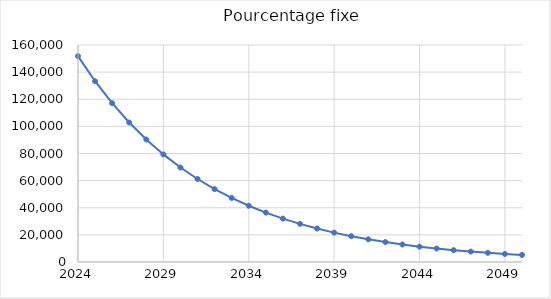
| Category | Pourcentage fixe |
|---|---|
| 2024.0 | 151788 |
| 2025.0 | 133316.002 |
| 2026.0 | 117091.973 |
| 2027.0 | 102842.344 |
| 2028.0 | 90326.838 |
| 2029.0 | 79334.42 |
| 2030.0 | 69679.736 |
| 2031.0 | 61199.988 |
| 2032.0 | 53752.192 |
| 2033.0 | 47210.763 |
| 2034.0 | 41465.4 |
| 2035.0 | 36419.226 |
| 2036.0 | 31987.15 |
| 2037.0 | 28094.441 |
| 2038.0 | 24675.459 |
| 2039.0 | 21672.553 |
| 2040.0 | 19035.089 |
| 2041.0 | 16718.594 |
| 2042.0 | 14684.008 |
| 2043.0 | 12897.022 |
| 2044.0 | 11327.506 |
| 2045.0 | 9948.993 |
| 2046.0 | 8738.24 |
| 2047.0 | 7674.831 |
| 2048.0 | 6740.834 |
| 2049.0 | 5920.502 |
| 2050.0 | 5200 |